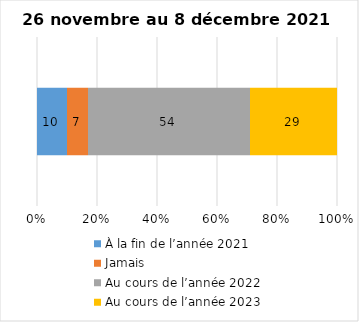
| Category | À la fin de l’année 2021 | Jamais | Au cours de l’année 2022 | Au cours de l’année 2023 |
|---|---|---|---|---|
| 0 | 10 | 7 | 54 | 29 |